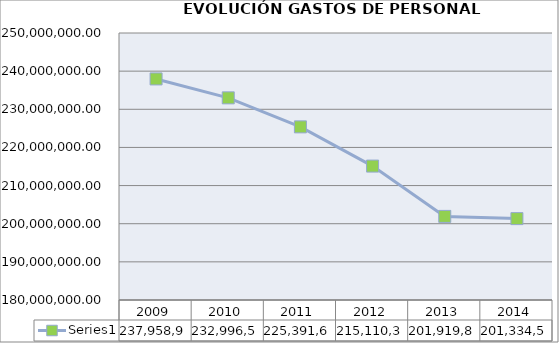
| Category | Series 1 |
|---|---|
| 2009.0 | 237958921.74 |
| 2010.0 | 232996506.31 |
| 2011.0 | 225391661.23 |
| 2012.0 | 215110369.31 |
| 2013.0 | 201919865.68 |
| 2014.0 | 201334556.05 |